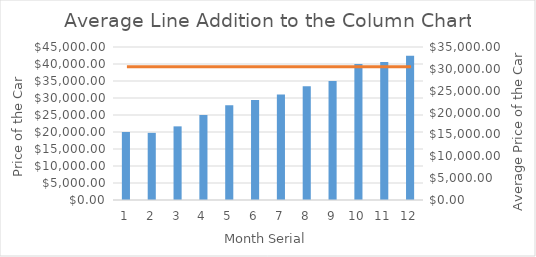
| Category | Price of the Car |
|---|---|
| 0 | 20000 |
| 1 | 19750 |
| 2 | 21659 |
| 3 | 24999 |
| 4 | 27890 |
| 5 | 29390 |
| 6 | 30999 |
| 7 | 33450 |
| 8 | 35000 |
| 9 | 40000 |
| 10 | 40560 |
| 11 | 42400 |